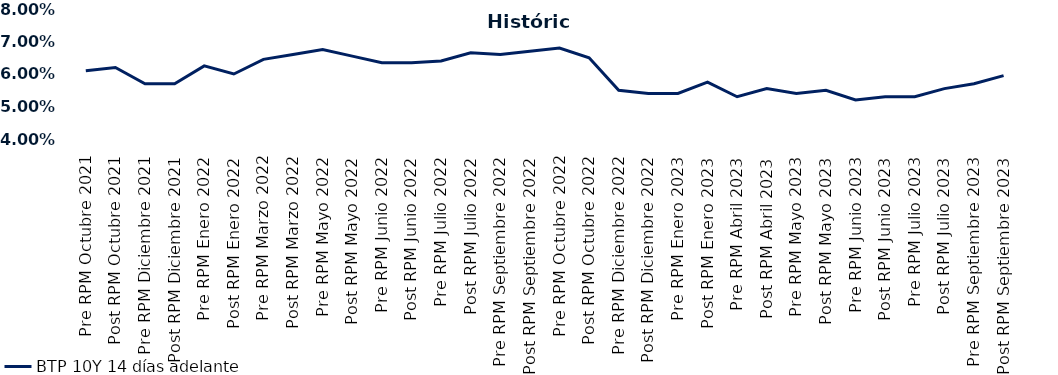
| Category | BTP 10Y 14 días adelante |
|---|---|
| Pre RPM Octubre 2021 | 0.061 |
| Post RPM Octubre 2021 | 0.062 |
| Pre RPM Diciembre 2021 | 0.057 |
| Post RPM Diciembre 2021 | 0.057 |
| Pre RPM Enero 2022 | 0.062 |
| Post RPM Enero 2022 | 0.06 |
| Pre RPM Marzo 2022 | 0.064 |
| Post RPM Marzo 2022 | 0.066 |
| Pre RPM Mayo 2022 | 0.068 |
| Post RPM Mayo 2022 | 0.066 |
| Pre RPM Junio 2022 | 0.064 |
| Post RPM Junio 2022 | 0.064 |
| Pre RPM Julio 2022 | 0.064 |
| Post RPM Julio 2022 | 0.066 |
| Pre RPM Septiembre 2022 | 0.066 |
| Post RPM Septiembre 2022 | 0.067 |
| Pre RPM Octubre 2022 | 0.068 |
| Post RPM Octubre 2022 | 0.065 |
| Pre RPM Diciembre 2022 | 0.055 |
| Post RPM Diciembre 2022 | 0.054 |
| Pre RPM Enero 2023 | 0.054 |
| Post RPM Enero 2023 | 0.058 |
| Pre RPM Abril 2023 | 0.053 |
| Post RPM Abril 2023 | 0.056 |
| Pre RPM Mayo 2023 | 0.054 |
| Post RPM Mayo 2023 | 0.055 |
| Pre RPM Junio 2023 | 0.052 |
| Post RPM Junio 2023 | 0.053 |
| Pre RPM Julio 2023 | 0.053 |
| Post RPM Julio 2023 | 0.056 |
| Pre RPM Septiembre 2023 | 0.057 |
| Post RPM Septiembre 2023 | 0.06 |